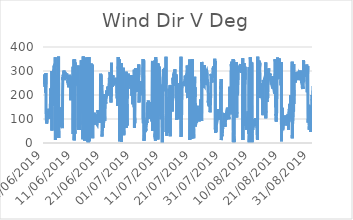
| Category | Wind Dir V |
|---|---|
| 01/06/2019 | 286 |
| 01/06/2019 | 285 |
| 01/06/2019 | 246 |
| 01/06/2019 | 266 |
| 01/06/2019 | 246 |
| 01/06/2019 | 245 |
| 01/06/2019 | 257 |
| 01/06/2019 | 244 |
| 01/06/2019 | 234 |
| 01/06/2019 | 235 |
| 01/06/2019 | 285 |
| 01/06/2019 | 281 |
| 01/06/2019 | 210 |
| 01/06/2019 | 235 |
| 01/06/2019 | 265 |
| 01/06/2019 | 292 |
| 01/06/2019 | 244 |
| 01/06/2019 | 118 |
| 01/06/2019 | 106 |
| 01/06/2019 | 94 |
| 01/06/2019 | 91 |
| 01/06/2019 | 81 |
| 01/06/2019 | 84 |
| 01/06/2019 | 78 |
| 02/06/2019 | 83 |
| 02/06/2019 | 87 |
| 02/06/2019 | 93 |
| 02/06/2019 | 100 |
| 02/06/2019 | 101 |
| 02/06/2019 | 100 |
| 02/06/2019 | 100 |
| 02/06/2019 | 101 |
| 02/06/2019 | 103 |
| 02/06/2019 | 98 |
| 02/06/2019 | 97 |
| 02/06/2019 | 105 |
| 02/06/2019 | 117 |
| 02/06/2019 | 127 |
| 02/06/2019 | 143 |
| 02/06/2019 | 138 |
| 02/06/2019 | 136 |
| 02/06/2019 | 135 |
| 02/06/2019 | 120 |
| 02/06/2019 | 112 |
| 02/06/2019 | 102 |
| 02/06/2019 | 106 |
| 02/06/2019 | 104 |
| 02/06/2019 | 102 |
| 03/06/2019 | 107 |
| 03/06/2019 | 119 |
| 03/06/2019 | 128 |
| 03/06/2019 | 156 |
| 03/06/2019 | 152 |
| 03/06/2019 | 173 |
| 03/06/2019 | 192 |
| 03/06/2019 | 183 |
| 03/06/2019 | 225 |
| 03/06/2019 | 220 |
| 03/06/2019 | 229 |
| 03/06/2019 | 233 |
| 03/06/2019 | 224 |
| 03/06/2019 | 212 |
| 03/06/2019 | 233 |
| 03/06/2019 | 238 |
| 03/06/2019 | 300 |
| 03/06/2019 | 52 |
| 03/06/2019 | 149 |
| 03/06/2019 | 182 |
| 03/06/2019 | 172 |
| 03/06/2019 | 154 |
| 03/06/2019 | 223 |
| 03/06/2019 | 190 |
| 04/06/2019 | 166 |
| 04/06/2019 | 196 |
| 04/06/2019 | 217 |
| 04/06/2019 | 243 |
| 04/06/2019 | 250 |
| 04/06/2019 | 281 |
| 04/06/2019 | 299 |
| 04/06/2019 | 312 |
| 04/06/2019 | 319 |
| 04/06/2019 | 321 |
| 04/06/2019 | 321 |
| 04/06/2019 | 317 |
| 04/06/2019 | 319 |
| 04/06/2019 | 318 |
| 04/06/2019 | 324 |
| 04/06/2019 | 326 |
| 04/06/2019 | 324 |
| 04/06/2019 | 317 |
| 04/06/2019 | 321 |
| 04/06/2019 | 331 |
| 04/06/2019 | 357 |
| 04/06/2019 | 13 |
| 04/06/2019 | 15 |
| 04/06/2019 | 36 |
| 05/06/2019 | 102 |
| 05/06/2019 | 98 |
| 05/06/2019 | 94 |
| 05/06/2019 | 90 |
| 05/06/2019 | 95 |
| 05/06/2019 | 112 |
| 05/06/2019 | 126 |
| 05/06/2019 | 159 |
| 05/06/2019 | 181 |
| 05/06/2019 | 192 |
| 05/06/2019 | 196 |
| 05/06/2019 | 209 |
| 05/06/2019 | 226 |
| 05/06/2019 | 249 |
| 05/06/2019 | 266 |
| 05/06/2019 | 282 |
| 05/06/2019 | 283 |
| 05/06/2019 | 287 |
| 05/06/2019 | 291 |
| 05/06/2019 | 298 |
| 05/06/2019 | 319 |
| 05/06/2019 | 335 |
| 05/06/2019 | 341 |
| 05/06/2019 | 360 |
| 06/06/2019 | 21 |
| 06/06/2019 | 50 |
| 06/06/2019 | 103 |
| 06/06/2019 | 95 |
| 06/06/2019 | 105 |
| 06/06/2019 | 83 |
| 06/06/2019 | 100 |
| 06/06/2019 | 120 |
| 06/06/2019 | 129 |
| 06/06/2019 | 130 |
| 06/06/2019 | 124 |
| 06/06/2019 | 142 |
| 06/06/2019 | 141 |
| 06/06/2019 | 146 |
| 06/06/2019 | 142 |
| 06/06/2019 | 135 |
| 06/06/2019 | 139 |
| 06/06/2019 | 148 |
| 06/06/2019 | 143 |
| 06/06/2019 | 131 |
| 06/06/2019 | 108 |
| 06/06/2019 | 95 |
| 06/06/2019 | 92 |
| 06/06/2019 | 92 |
| 07/06/2019 | 67 |
| 07/06/2019 | 126 |
| 07/06/2019 | 83 |
| 07/06/2019 | 77 |
| 07/06/2019 | 84 |
| 07/06/2019 | 62 |
| 07/06/2019 | 78 |
| 07/06/2019 | 107 |
| 07/06/2019 | 218 |
| 07/06/2019 | 243 |
| 07/06/2019 | 274 |
| 07/06/2019 | 262 |
| 07/06/2019 | 276 |
| 07/06/2019 | 285 |
| 07/06/2019 | 279 |
| 07/06/2019 | 281 |
| 07/06/2019 | 280 |
| 07/06/2019 | 288 |
| 07/06/2019 | 289 |
| 07/06/2019 | 302 |
| 07/06/2019 | 301 |
| 07/06/2019 | 289 |
| 07/06/2019 | 297 |
| 07/06/2019 | 283 |
| 08/06/2019 | 271 |
| 08/06/2019 | 262 |
| 08/06/2019 | 271 |
| 08/06/2019 | 295 |
| 08/06/2019 | 299 |
| 08/06/2019 | 297 |
| 08/06/2019 | 296 |
| 08/06/2019 | 297 |
| 08/06/2019 | 291 |
| 08/06/2019 | 295 |
| 08/06/2019 | 292 |
| 08/06/2019 | 283 |
| 08/06/2019 | 282 |
| 08/06/2019 | 283 |
| 08/06/2019 | 280 |
| 08/06/2019 | 284 |
| 08/06/2019 | 282 |
| 08/06/2019 | 284 |
| 08/06/2019 | 290 |
| 08/06/2019 | 279 |
| 08/06/2019 | 268 |
| 08/06/2019 | 271 |
| 08/06/2019 | 276 |
| 08/06/2019 | 275 |
| 09/06/2019 | 284 |
| 09/06/2019 | 277 |
| 09/06/2019 | 273 |
| 09/06/2019 | 271 |
| 09/06/2019 | 249 |
| 09/06/2019 | 261 |
| 09/06/2019 | 250 |
| 09/06/2019 | 243 |
| 09/06/2019 | 243 |
| 09/06/2019 | 250 |
| 09/06/2019 | 232 |
| 09/06/2019 | 237 |
| 09/06/2019 | 246 |
| 09/06/2019 | 252 |
| 09/06/2019 | 284 |
| 09/06/2019 | 282 |
| 09/06/2019 | 287 |
| 09/06/2019 | 285 |
| 09/06/2019 | 280 |
| 09/06/2019 | 271 |
| 09/06/2019 | 257 |
| 09/06/2019 | 261 |
| 09/06/2019 | 264 |
| 09/06/2019 | 265 |
| 10/06/2019 | 261 |
| 10/06/2019 | 258 |
| 10/06/2019 | 255 |
| 10/06/2019 | 247 |
| 10/06/2019 | 178 |
| 10/06/2019 | 236 |
| 10/06/2019 | 233 |
| 10/06/2019 | 180 |
| 10/06/2019 | 199 |
| 10/06/2019 | 209 |
| 10/06/2019 | 260 |
| 10/06/2019 | 247 |
| 10/06/2019 | 268 |
| 10/06/2019 | 261 |
| 10/06/2019 | 244 |
| 10/06/2019 | 256 |
| 10/06/2019 | 266 |
| 10/06/2019 | 264 |
| 10/06/2019 | 277 |
| 10/06/2019 | 238 |
| 10/06/2019 | 264 |
| 10/06/2019 | 300 |
| 10/06/2019 | 318 |
| 10/06/2019 | 38 |
| 11/06/2019 | 267 |
| 11/06/2019 | 222 |
| 11/06/2019 | 160 |
| 11/06/2019 | 301 |
| 11/06/2019 | 305 |
| 11/06/2019 | 289 |
| 11/06/2019 | 348 |
| 11/06/2019 | 11 |
| 11/06/2019 | 27 |
| 11/06/2019 | 31 |
| 11/06/2019 | 49 |
| 11/06/2019 | 348 |
| 11/06/2019 | 350 |
| 11/06/2019 | 39 |
| 11/06/2019 | 49 |
| 11/06/2019 | 335 |
| 11/06/2019 | 289 |
| 11/06/2019 | 274 |
| 11/06/2019 | 284 |
| 11/06/2019 | 288 |
| 11/06/2019 | 281 |
| 11/06/2019 | 294 |
| 11/06/2019 | 296 |
| 11/06/2019 | 278 |
| 12/06/2019 | 267 |
| 12/06/2019 | 282 |
| 12/06/2019 | 272 |
| 12/06/2019 | 257 |
| 12/06/2019 | 260 |
| 12/06/2019 | 265 |
| 12/06/2019 | 258 |
| 12/06/2019 | 258 |
| 12/06/2019 | 263 |
| 12/06/2019 | 280 |
| 12/06/2019 | 264 |
| 12/06/2019 | 243 |
| 12/06/2019 | 263 |
| 12/06/2019 | 244 |
| 12/06/2019 | 237 |
| 12/06/2019 | 243 |
| 12/06/2019 | 323 |
| 12/06/2019 | 68 |
| 12/06/2019 | 55 |
| 12/06/2019 | 66 |
| 12/06/2019 | 90 |
| 12/06/2019 | 91 |
| 12/06/2019 | 102 |
| 12/06/2019 | 103 |
| 13/06/2019 | 104 |
| 13/06/2019 | 97 |
| 13/06/2019 | 111 |
| 13/06/2019 | 54 |
| 13/06/2019 | 80 |
| 13/06/2019 | 80 |
| 13/06/2019 | 91 |
| 13/06/2019 | 77 |
| 13/06/2019 | 166 |
| 13/06/2019 | 124 |
| 13/06/2019 | 125 |
| 13/06/2019 | 142 |
| 13/06/2019 | 241 |
| 13/06/2019 | 275 |
| 13/06/2019 | 272 |
| 13/06/2019 | 288 |
| 13/06/2019 | 303 |
| 13/06/2019 | 345 |
| 13/06/2019 | 236 |
| 13/06/2019 | 253 |
| 13/06/2019 | 280 |
| 13/06/2019 | 243 |
| 13/06/2019 | 133 |
| 13/06/2019 | 127 |
| 14/06/2019 | 171 |
| 14/06/2019 | 147 |
| 14/06/2019 | 129 |
| 14/06/2019 | 199 |
| 14/06/2019 | 128 |
| 14/06/2019 | 16 |
| 14/06/2019 | 58 |
| 14/06/2019 | 80 |
| 14/06/2019 | 334 |
| 14/06/2019 | 274 |
| 14/06/2019 | 360 |
| 14/06/2019 | 151 |
| 14/06/2019 | 133 |
| 14/06/2019 | 107 |
| 14/06/2019 | 93 |
| 14/06/2019 | 106 |
| 14/06/2019 | 112 |
| 14/06/2019 | 126 |
| 14/06/2019 | 89 |
| 14/06/2019 | 9 |
| 14/06/2019 | 57 |
| 14/06/2019 | 80 |
| 14/06/2019 | 94 |
| 14/06/2019 | 34 |
| 15/06/2019 | 17 |
| 15/06/2019 | 44 |
| 15/06/2019 | 355 |
| 15/06/2019 | 312 |
| 15/06/2019 | 340 |
| 15/06/2019 | 65 |
| 15/06/2019 | 49 |
| 15/06/2019 | 295 |
| 15/06/2019 | 292 |
| 15/06/2019 | 282 |
| 15/06/2019 | 282 |
| 15/06/2019 | 297 |
| 15/06/2019 | 309 |
| 15/06/2019 | 352 |
| 15/06/2019 | 335 |
| 15/06/2019 | 337 |
| 15/06/2019 | 356 |
| 15/06/2019 | 24 |
| 15/06/2019 | 22 |
| 15/06/2019 | 26 |
| 15/06/2019 | 14 |
| 15/06/2019 | 24 |
| 15/06/2019 | 21 |
| 15/06/2019 | 6 |
| 16/06/2019 | 333 |
| 16/06/2019 | 327 |
| 16/06/2019 | 321 |
| 16/06/2019 | 0 |
| 16/06/2019 | 10 |
| 16/06/2019 | 305 |
| 16/06/2019 | 316 |
| 16/06/2019 | 330 |
| 16/06/2019 | 333 |
| 16/06/2019 | 348 |
| 16/06/2019 | 358 |
| 16/06/2019 | 12 |
| 16/06/2019 | 7 |
| 16/06/2019 | 9 |
| 16/06/2019 | 34 |
| 16/06/2019 | 22 |
| 16/06/2019 | 21 |
| 16/06/2019 | 29 |
| 16/06/2019 | 34 |
| 16/06/2019 | 48 |
| 16/06/2019 | 57 |
| 16/06/2019 | 59 |
| 16/06/2019 | 50 |
| 16/06/2019 | 45 |
| 17/06/2019 | 41 |
| 17/06/2019 | 255 |
| 17/06/2019 | 267 |
| 17/06/2019 | 319 |
| 17/06/2019 | 331 |
| 17/06/2019 | 321 |
| 17/06/2019 | 253 |
| 17/06/2019 | 246 |
| 17/06/2019 | 254 |
| 17/06/2019 | 277 |
| 17/06/2019 | 305 |
| 17/06/2019 | 296 |
| 17/06/2019 | 256 |
| 17/06/2019 | 326 |
| 17/06/2019 | 59 |
| 17/06/2019 | 20 |
| 17/06/2019 | 75 |
| 17/06/2019 | 92 |
| 17/06/2019 | 75 |
| 17/06/2019 | 78 |
| 17/06/2019 | 85 |
| 17/06/2019 | 94 |
| 17/06/2019 | 100 |
| 17/06/2019 | 114 |
| 18/06/2019 | 113 |
| 18/06/2019 | 81 |
| 18/06/2019 | 76 |
| 18/06/2019 | 126 |
| 18/06/2019 | 95 |
| 18/06/2019 | 78 |
| 18/06/2019 | 90 |
| 18/06/2019 | 117 |
| 18/06/2019 | 93 |
| 18/06/2019 | 113 |
| 18/06/2019 | 92 |
| 18/06/2019 | 95 |
| 18/06/2019 | 111 |
| 18/06/2019 | 107 |
| 18/06/2019 | 104 |
| 18/06/2019 | 111 |
| 18/06/2019 | 119 |
| 18/06/2019 | 116 |
| 18/06/2019 | 111 |
| 18/06/2019 | 116 |
| 18/06/2019 | 88 |
| 18/06/2019 | 83 |
| 18/06/2019 | 84 |
| 18/06/2019 | 87 |
| 19/06/2019 | 85 |
| 19/06/2019 | 80 |
| 19/06/2019 | 82 |
| 19/06/2019 | 81 |
| 19/06/2019 | 77 |
| 19/06/2019 | 83 |
| 19/06/2019 | 88 |
| 19/06/2019 | 103 |
| 19/06/2019 | 126 |
| 19/06/2019 | 137 |
| 19/06/2019 | 137 |
| 19/06/2019 | 133 |
| 19/06/2019 | 127 |
| 19/06/2019 | 128 |
| 19/06/2019 | 129 |
| 19/06/2019 | 127 |
| 19/06/2019 | 126 |
| 19/06/2019 | 127 |
| 19/06/2019 | 130 |
| 19/06/2019 | 120 |
| 19/06/2019 | 113 |
| 19/06/2019 | 117 |
| 19/06/2019 | 104 |
| 19/06/2019 | 104 |
| 20/06/2019 | 94 |
| 20/06/2019 | 86 |
| 20/06/2019 | 87 |
| 20/06/2019 | 91 |
| 20/06/2019 | 84 |
| 20/06/2019 | 88 |
| 20/06/2019 | 109 |
| 20/06/2019 | 222 |
| 20/06/2019 | 289 |
| 20/06/2019 | 258 |
| 20/06/2019 | 287 |
| 20/06/2019 | 285 |
| 20/06/2019 | 286 |
| 20/06/2019 | 287 |
| 20/06/2019 | 244 |
| 20/06/2019 | 246 |
| 20/06/2019 | 240 |
| 20/06/2019 | 237 |
| 20/06/2019 | 242 |
| 20/06/2019 | 200 |
| 20/06/2019 | 27 |
| 20/06/2019 | 38 |
| 20/06/2019 | 42 |
| 20/06/2019 | 52 |
| 21/06/2019 | 64 |
| 21/06/2019 | 65 |
| 21/06/2019 | 71 |
| 21/06/2019 | 63 |
| 21/06/2019 | 68 |
| 21/06/2019 | 74 |
| 21/06/2019 | 65 |
| 21/06/2019 | 74 |
| 21/06/2019 | 82 |
| 21/06/2019 | 85 |
| 21/06/2019 | 87 |
| 21/06/2019 | 88 |
| 21/06/2019 | 90 |
| 21/06/2019 | 95 |
| 21/06/2019 | 95 |
| 21/06/2019 | 99 |
| 21/06/2019 | 204 |
| 21/06/2019 | 113 |
| 21/06/2019 | 92 |
| 21/06/2019 | 98 |
| 21/06/2019 | 105 |
| 21/06/2019 | 137 |
| 21/06/2019 | 157 |
| 21/06/2019 | 170 |
| 22/06/2019 | 173 |
| 22/06/2019 | 177 |
| 22/06/2019 | 164 |
| 22/06/2019 | 170 |
| 22/06/2019 | 180 |
| 22/06/2019 | 181 |
| 22/06/2019 | 186 |
| 22/06/2019 | 197 |
| 22/06/2019 | 196 |
| 22/06/2019 | 191 |
| 22/06/2019 | 219 |
| 22/06/2019 | 197 |
| 22/06/2019 | 197 |
| 22/06/2019 | 195 |
| 22/06/2019 | 207 |
| 22/06/2019 | 199 |
| 22/06/2019 | 198 |
| 22/06/2019 | 198 |
| 22/06/2019 | 210 |
| 22/06/2019 | 215 |
| 22/06/2019 | 235 |
| 22/06/2019 | 223 |
| 22/06/2019 | 235 |
| 22/06/2019 | 234 |
| 23/06/2019 | 239 |
| 23/06/2019 | 234 |
| 23/06/2019 | 238 |
| 23/06/2019 | 223 |
| 23/06/2019 | 229 |
| 23/06/2019 | 237 |
| 23/06/2019 | 247 |
| 23/06/2019 | 260 |
| 23/06/2019 | 271 |
| 23/06/2019 | 260 |
| 23/06/2019 | 259 |
| 23/06/2019 | 261 |
| 23/06/2019 | 271 |
| 23/06/2019 | 289 |
| 23/06/2019 | 296 |
| 23/06/2019 | 261 |
| 23/06/2019 | 245 |
| 23/06/2019 | 238 |
| 23/06/2019 | 228 |
| 23/06/2019 | 218 |
| 23/06/2019 | 198 |
| 23/06/2019 | 169 |
| 23/06/2019 | 246 |
| 23/06/2019 | 195 |
| 24/06/2019 | 257 |
| 24/06/2019 | 304 |
| 24/06/2019 | 334 |
| 24/06/2019 | 245 |
| 24/06/2019 | 262 |
| 24/06/2019 | 248 |
| 24/06/2019 | 250 |
| 24/06/2019 | 233 |
| 24/06/2019 | 266 |
| 24/06/2019 | 244 |
| 24/06/2019 | 249 |
| 24/06/2019 | 255 |
| 24/06/2019 | 260 |
| 24/06/2019 | 273 |
| 24/06/2019 | 282 |
| 24/06/2019 | 275 |
| 24/06/2019 | 274 |
| 24/06/2019 | 271 |
| 24/06/2019 | 240 |
| 24/06/2019 | 253 |
| 24/06/2019 | 269 |
| 24/06/2019 | 256 |
| 24/06/2019 | 264 |
| 24/06/2019 | 254 |
| 25/06/2019 | 256 |
| 25/06/2019 | 264 |
| 25/06/2019 | 257 |
| 25/06/2019 | 258 |
| 25/06/2019 | 258 |
| 25/06/2019 | 254 |
| 25/06/2019 | 247 |
| 25/06/2019 | 269 |
| 25/06/2019 | 261 |
| 25/06/2019 | 250 |
| 25/06/2019 | 246 |
| 25/06/2019 | 247 |
| 25/06/2019 | 264 |
| 25/06/2019 | 261 |
| 25/06/2019 | 259 |
| 25/06/2019 | 258 |
| 25/06/2019 | 258 |
| 25/06/2019 | 254 |
| 25/06/2019 | 259 |
| 25/06/2019 | 272 |
| 25/06/2019 | 244 |
| 25/06/2019 | 216 |
| 25/06/2019 | 219 |
| 25/06/2019 | 214 |
| 26/06/2019 | 185 |
| 26/06/2019 | 267 |
| 26/06/2019 | 225 |
| 26/06/2019 | 154 |
| 26/06/2019 | 225 |
| 26/06/2019 | 255 |
| 26/06/2019 | 243 |
| 26/06/2019 | 245 |
| 26/06/2019 | 241 |
| 26/06/2019 | 358 |
| 26/06/2019 | 309 |
| 26/06/2019 | 280 |
| 26/06/2019 | 260 |
| 26/06/2019 | 282 |
| 26/06/2019 | 258 |
| 26/06/2019 | 278 |
| 26/06/2019 | 264 |
| 26/06/2019 | 316 |
| 26/06/2019 | 277 |
| 26/06/2019 | 348 |
| 26/06/2019 | 7 |
| 26/06/2019 | 32 |
| 26/06/2019 | 57 |
| 26/06/2019 | 42 |
| 27/06/2019 | 54 |
| 27/06/2019 | 59 |
| 27/06/2019 | 60 |
| 27/06/2019 | 72 |
| 27/06/2019 | 58 |
| 27/06/2019 | 47 |
| 27/06/2019 | 47 |
| 27/06/2019 | 61 |
| 27/06/2019 | 55 |
| 27/06/2019 | 16 |
| 27/06/2019 | 333 |
| 27/06/2019 | 5 |
| 27/06/2019 | 67 |
| 27/06/2019 | 69 |
| 27/06/2019 | 81 |
| 27/06/2019 | 88 |
| 27/06/2019 | 90 |
| 27/06/2019 | 84 |
| 27/06/2019 | 81 |
| 27/06/2019 | 78 |
| 27/06/2019 | 74 |
| 27/06/2019 | 74 |
| 27/06/2019 | 78 |
| 27/06/2019 | 83 |
| 28/06/2019 | 89 |
| 28/06/2019 | 91 |
| 28/06/2019 | 265 |
| 28/06/2019 | 314 |
| 28/06/2019 | 69 |
| 28/06/2019 | 74 |
| 28/06/2019 | 59 |
| 28/06/2019 | 32 |
| 28/06/2019 | 52 |
| 28/06/2019 | 89 |
| 28/06/2019 | 118 |
| 28/06/2019 | 147 |
| 28/06/2019 | 118 |
| 28/06/2019 | 125 |
| 28/06/2019 | 104 |
| 28/06/2019 | 92 |
| 28/06/2019 | 86 |
| 28/06/2019 | 94 |
| 28/06/2019 | 100 |
| 28/06/2019 | 101 |
| 28/06/2019 | 92 |
| 28/06/2019 | 85 |
| 28/06/2019 | 82 |
| 28/06/2019 | 84 |
| 29/06/2019 | 98 |
| 29/06/2019 | 92 |
| 29/06/2019 | 297 |
| 29/06/2019 | 79 |
| 29/06/2019 | 78 |
| 29/06/2019 | 63 |
| 29/06/2019 | 81 |
| 29/06/2019 | 97 |
| 29/06/2019 | 88 |
| 29/06/2019 | 82 |
| 29/06/2019 | 73 |
| 29/06/2019 | 163 |
| 29/06/2019 | 187 |
| 29/06/2019 | 227 |
| 29/06/2019 | 234 |
| 29/06/2019 | 228 |
| 29/06/2019 | 234 |
| 29/06/2019 | 226 |
| 29/06/2019 | 251 |
| 29/06/2019 | 289 |
| 29/06/2019 | 291 |
| 29/06/2019 | 287 |
| 29/06/2019 | 260 |
| 29/06/2019 | 251 |
| 30/06/2019 | 240 |
| 30/06/2019 | 257 |
| 30/06/2019 | 248 |
| 30/06/2019 | 240 |
| 30/06/2019 | 251 |
| 30/06/2019 | 245 |
| 30/06/2019 | 239 |
| 30/06/2019 | 244 |
| 30/06/2019 | 257 |
| 30/06/2019 | 263 |
| 30/06/2019 | 268 |
| 30/06/2019 | 261 |
| 30/06/2019 | 282 |
| 30/06/2019 | 265 |
| 30/06/2019 | 260 |
| 30/06/2019 | 262 |
| 30/06/2019 | 234 |
| 30/06/2019 | 236 |
| 30/06/2019 | 237 |
| 30/06/2019 | 229 |
| 30/06/2019 | 241 |
| 30/06/2019 | 254 |
| 30/06/2019 | 270 |
| 30/06/2019 | 250 |
| 01/07/2019 | 246 |
| 01/07/2019 | 283 |
| 01/07/2019 | 197 |
| 01/07/2019 | 254 |
| 01/07/2019 | 222 |
| 01/07/2019 | 266 |
| 01/07/2019 | 202 |
| 01/07/2019 | 161 |
| 01/07/2019 | 173 |
| 01/07/2019 | 182 |
| 01/07/2019 | 201 |
| 01/07/2019 | 193 |
| 01/07/2019 | 182 |
| 01/07/2019 | 190 |
| 01/07/2019 | 198 |
| 01/07/2019 | 191 |
| 01/07/2019 | 196 |
| 01/07/2019 | 183 |
| 01/07/2019 | 176 |
| 01/07/2019 | 154 |
| 01/07/2019 | 149 |
| 01/07/2019 | 305 |
| 01/07/2019 | 64 |
| 01/07/2019 | 114 |
| 02/07/2019 | 82 |
| 02/07/2019 | 107 |
| 02/07/2019 | 143 |
| 02/07/2019 | 246 |
| 02/07/2019 | 266 |
| 02/07/2019 | 305 |
| 02/07/2019 | 305 |
| 02/07/2019 | 311 |
| 02/07/2019 | 298 |
| 02/07/2019 | 305 |
| 02/07/2019 | 307 |
| 02/07/2019 | 310 |
| 02/07/2019 | 305 |
| 02/07/2019 | 279 |
| 02/07/2019 | 265 |
| 02/07/2019 | 296 |
| 02/07/2019 | 309 |
| 02/07/2019 | 288 |
| 02/07/2019 | 295 |
| 02/07/2019 | 309 |
| 02/07/2019 | 306 |
| 02/07/2019 | 212 |
| 02/07/2019 | 268 |
| 02/07/2019 | 264 |
| 03/07/2019 | 247 |
| 03/07/2019 | 236 |
| 03/07/2019 | 262 |
| 03/07/2019 | 275 |
| 03/07/2019 | 250 |
| 03/07/2019 | 262 |
| 03/07/2019 | 279 |
| 03/07/2019 | 290 |
| 03/07/2019 | 269 |
| 03/07/2019 | 327 |
| 03/07/2019 | 274 |
| 03/07/2019 | 204 |
| 03/07/2019 | 169 |
| 03/07/2019 | 172 |
| 03/07/2019 | 195 |
| 03/07/2019 | 224 |
| 03/07/2019 | 223 |
| 03/07/2019 | 197 |
| 03/07/2019 | 222 |
| 03/07/2019 | 225 |
| 03/07/2019 | 229 |
| 03/07/2019 | 239 |
| 03/07/2019 | 230 |
| 03/07/2019 | 258 |
| 04/07/2019 | 242 |
| 04/07/2019 | 252 |
| 04/07/2019 | 248 |
| 04/07/2019 | 228 |
| 04/07/2019 | 234 |
| 04/07/2019 | 216 |
| 04/07/2019 | 200 |
| 04/07/2019 | 237 |
| 04/07/2019 | 237 |
| 04/07/2019 | 229 |
| 04/07/2019 | 223 |
| 04/07/2019 | 257 |
| 04/07/2019 | 247 |
| 04/07/2019 | 246 |
| 04/07/2019 | 253 |
| 04/07/2019 | 239 |
| 04/07/2019 | 236 |
| 04/07/2019 | 246 |
| 04/07/2019 | 261 |
| 04/07/2019 | 314 |
| 04/07/2019 | 324 |
| 04/07/2019 | 350 |
| 04/07/2019 | 101 |
| 04/07/2019 | 82 |
| 05/07/2019 | 251 |
| 05/07/2019 | 337 |
| 05/07/2019 | 345 |
| 05/07/2019 | 348 |
| 05/07/2019 | 342 |
| 05/07/2019 | 9 |
| 05/07/2019 | 34 |
| 05/07/2019 | 74 |
| 05/07/2019 | 81 |
| 05/07/2019 | 66 |
| 05/07/2019 | 58 |
| 05/07/2019 | 45 |
| 05/07/2019 | 47 |
| 05/07/2019 | 52 |
| 05/07/2019 | 46 |
| 05/07/2019 | 46 |
| 05/07/2019 | 56 |
| 05/07/2019 | 63 |
| 05/07/2019 | 64 |
| 05/07/2019 | 65 |
| 05/07/2019 | 51 |
| 05/07/2019 | 58 |
| 05/07/2019 | 68 |
| 05/07/2019 | 69 |
| 06/07/2019 | 76 |
| 06/07/2019 | 95 |
| 06/07/2019 | 84 |
| 06/07/2019 | 89 |
| 06/07/2019 | 86 |
| 06/07/2019 | 84 |
| 06/07/2019 | 106 |
| 06/07/2019 | 113 |
| 06/07/2019 | 126 |
| 06/07/2019 | 146 |
| 06/07/2019 | 145 |
| 06/07/2019 | 162 |
| 06/07/2019 | 169 |
| 06/07/2019 | 131 |
| 06/07/2019 | 146 |
| 06/07/2019 | 155 |
| 06/07/2019 | 177 |
| 06/07/2019 | 168 |
| 06/07/2019 | 174 |
| 06/07/2019 | 173 |
| 06/07/2019 | 128 |
| 06/07/2019 | 111 |
| 06/07/2019 | 100 |
| 06/07/2019 | 105 |
| 07/07/2019 | 107 |
| 07/07/2019 | 100 |
| 07/07/2019 | 102 |
| 07/07/2019 | 104 |
| 07/07/2019 | 107 |
| 07/07/2019 | 103 |
| 07/07/2019 | 118 |
| 07/07/2019 | 129 |
| 07/07/2019 | 140 |
| 07/07/2019 | 140 |
| 07/07/2019 | 140 |
| 07/07/2019 | 142 |
| 07/07/2019 | 144 |
| 07/07/2019 | 148 |
| 07/07/2019 | 159 |
| 07/07/2019 | 162 |
| 07/07/2019 | 171 |
| 07/07/2019 | 162 |
| 07/07/2019 | 160 |
| 07/07/2019 | 148 |
| 07/07/2019 | 112 |
| 07/07/2019 | 90 |
| 07/07/2019 | 124 |
| 07/07/2019 | 120 |
| 08/07/2019 | 298 |
| 08/07/2019 | 335 |
| 08/07/2019 | 342 |
| 08/07/2019 | 50 |
| 08/07/2019 | 116 |
| 08/07/2019 | 150 |
| 08/07/2019 | 139 |
| 08/07/2019 | 272 |
| 08/07/2019 | 341 |
| 08/07/2019 | 343 |
| 08/07/2019 | 268 |
| 08/07/2019 | 233 |
| 08/07/2019 | 257 |
| 08/07/2019 | 250 |
| 08/07/2019 | 325 |
| 08/07/2019 | 341 |
| 08/07/2019 | 321 |
| 08/07/2019 | 324 |
| 08/07/2019 | 328 |
| 08/07/2019 | 311 |
| 08/07/2019 | 303 |
| 08/07/2019 | 315 |
| 08/07/2019 | 325 |
| 08/07/2019 | 345 |
| 09/07/2019 | 24 |
| 09/07/2019 | 39 |
| 09/07/2019 | 8 |
| 09/07/2019 | 9 |
| 09/07/2019 | 352 |
| 09/07/2019 | 358 |
| 09/07/2019 | 355 |
| 09/07/2019 | 334 |
| 09/07/2019 | 245 |
| 09/07/2019 | 239 |
| 09/07/2019 | 287 |
| 09/07/2019 | 302 |
| 09/07/2019 | 315 |
| 09/07/2019 | 319 |
| 09/07/2019 | 324 |
| 09/07/2019 | 326 |
| 09/07/2019 | 333 |
| 09/07/2019 | 316 |
| 09/07/2019 | 298 |
| 09/07/2019 | 304 |
| 09/07/2019 | 316 |
| 09/07/2019 | 321 |
| 09/07/2019 | 315 |
| 09/07/2019 | 15 |
| 10/07/2019 | 331 |
| 10/07/2019 | 298 |
| 10/07/2019 | 308 |
| 10/07/2019 | 302 |
| 10/07/2019 | 311 |
| 10/07/2019 | 297 |
| 10/07/2019 | 301 |
| 10/07/2019 | 310 |
| 10/07/2019 | 310 |
| 10/07/2019 | 318 |
| 10/07/2019 | 319 |
| 10/07/2019 | 317 |
| 10/07/2019 | 296 |
| 10/07/2019 | 264 |
| 10/07/2019 | 228 |
| 10/07/2019 | 223 |
| 10/07/2019 | 224 |
| 10/07/2019 | 169 |
| 10/07/2019 | 181 |
| 10/07/2019 | 188 |
| 10/07/2019 | 138 |
| 10/07/2019 | 106 |
| 10/07/2019 | 99 |
| 10/07/2019 | 98 |
| 11/07/2019 | 103 |
| 11/07/2019 | 105 |
| 11/07/2019 | 107 |
| 11/07/2019 | 121 |
| 11/07/2019 | 156 |
| 11/07/2019 | 165 |
| 11/07/2019 | 182 |
| 11/07/2019 | 191 |
| 11/07/2019 | 198 |
| 11/07/2019 | 227 |
| 11/07/2019 | 229 |
| 11/07/2019 | 0 |
| 11/07/2019 | 241 |
| 11/07/2019 | 245 |
| 11/07/2019 | 244 |
| 11/07/2019 | 247 |
| 11/07/2019 | 264 |
| 11/07/2019 | 274 |
| 11/07/2019 | 277 |
| 11/07/2019 | 297 |
| 11/07/2019 | 308 |
| 11/07/2019 | 284 |
| 11/07/2019 | 270 |
| 11/07/2019 | 275 |
| 12/07/2019 | 265 |
| 12/07/2019 | 264 |
| 12/07/2019 | 280 |
| 12/07/2019 | 294 |
| 12/07/2019 | 313 |
| 12/07/2019 | 256 |
| 12/07/2019 | 242 |
| 12/07/2019 | 245 |
| 12/07/2019 | 216 |
| 12/07/2019 | 269 |
| 12/07/2019 | 251 |
| 12/07/2019 | 241 |
| 12/07/2019 | 250 |
| 12/07/2019 | 285 |
| 12/07/2019 | 262 |
| 12/07/2019 | 246 |
| 12/07/2019 | 307 |
| 12/07/2019 | 359 |
| 12/07/2019 | 46 |
| 12/07/2019 | 112 |
| 12/07/2019 | 121 |
| 12/07/2019 | 95 |
| 12/07/2019 | 59 |
| 12/07/2019 | 30 |
| 13/07/2019 | 43 |
| 13/07/2019 | 55 |
| 13/07/2019 | 137 |
| 13/07/2019 | 59 |
| 13/07/2019 | 42 |
| 13/07/2019 | 38 |
| 13/07/2019 | 90 |
| 13/07/2019 | 90 |
| 13/07/2019 | 90 |
| 13/07/2019 | 97 |
| 13/07/2019 | 111 |
| 13/07/2019 | 125 |
| 13/07/2019 | 132 |
| 13/07/2019 | 141 |
| 13/07/2019 | 174 |
| 13/07/2019 | 211 |
| 13/07/2019 | 217 |
| 13/07/2019 | 218 |
| 13/07/2019 | 226 |
| 13/07/2019 | 210 |
| 13/07/2019 | 103 |
| 13/07/2019 | 117 |
| 13/07/2019 | 127 |
| 13/07/2019 | 157 |
| 14/07/2019 | 210 |
| 14/07/2019 | 241 |
| 14/07/2019 | 232 |
| 14/07/2019 | 235 |
| 14/07/2019 | 28 |
| 14/07/2019 | 92 |
| 14/07/2019 | 130 |
| 14/07/2019 | 164 |
| 14/07/2019 | 231 |
| 14/07/2019 | 242 |
| 14/07/2019 | 233 |
| 14/07/2019 | 179 |
| 14/07/2019 | 196 |
| 14/07/2019 | 217 |
| 14/07/2019 | 211 |
| 14/07/2019 | 219 |
| 14/07/2019 | 216 |
| 14/07/2019 | 233 |
| 14/07/2019 | 221 |
| 14/07/2019 | 205 |
| 14/07/2019 | 192 |
| 14/07/2019 | 131 |
| 14/07/2019 | 142 |
| 14/07/2019 | 175 |
| 15/07/2019 | 182 |
| 15/07/2019 | 230 |
| 15/07/2019 | 251 |
| 15/07/2019 | 272 |
| 15/07/2019 | 247 |
| 15/07/2019 | 264 |
| 15/07/2019 | 275 |
| 15/07/2019 | 271 |
| 15/07/2019 | 267 |
| 15/07/2019 | 287 |
| 15/07/2019 | 282 |
| 15/07/2019 | 289 |
| 15/07/2019 | 289 |
| 15/07/2019 | 295 |
| 15/07/2019 | 286 |
| 15/07/2019 | 301 |
| 15/07/2019 | 305 |
| 15/07/2019 | 304 |
| 15/07/2019 | 307 |
| 15/07/2019 | 303 |
| 15/07/2019 | 295 |
| 15/07/2019 | 287 |
| 15/07/2019 | 238 |
| 15/07/2019 | 247 |
| 16/07/2019 | 252 |
| 16/07/2019 | 262 |
| 16/07/2019 | 246 |
| 16/07/2019 | 252 |
| 16/07/2019 | 286 |
| 16/07/2019 | 186 |
| 16/07/2019 | 248 |
| 16/07/2019 | 207 |
| 16/07/2019 | 97 |
| 16/07/2019 | 118 |
| 16/07/2019 | 118 |
| 16/07/2019 | 134 |
| 16/07/2019 | 138 |
| 16/07/2019 | 171 |
| 16/07/2019 | 185 |
| 16/07/2019 | 179 |
| 16/07/2019 | 148 |
| 16/07/2019 | 151 |
| 16/07/2019 | 125 |
| 16/07/2019 | 102 |
| 16/07/2019 | 107 |
| 16/07/2019 | 113 |
| 16/07/2019 | 105 |
| 16/07/2019 | 99 |
| 17/07/2019 | 96 |
| 17/07/2019 | 109 |
| 17/07/2019 | 108 |
| 17/07/2019 | 104 |
| 17/07/2019 | 116 |
| 17/07/2019 | 135 |
| 17/07/2019 | 186 |
| 17/07/2019 | 237 |
| 17/07/2019 | 242 |
| 17/07/2019 | 250 |
| 17/07/2019 | 250 |
| 17/07/2019 | 246 |
| 17/07/2019 | 251 |
| 17/07/2019 | 241 |
| 17/07/2019 | 243 |
| 17/07/2019 | 250 |
| 17/07/2019 | 252 |
| 17/07/2019 | 259 |
| 17/07/2019 | 279 |
| 17/07/2019 | 318 |
| 17/07/2019 | 359 |
| 17/07/2019 | 26 |
| 17/07/2019 | 92 |
| 17/07/2019 | 107 |
| 18/07/2019 | 98 |
| 18/07/2019 | 107 |
| 18/07/2019 | 165 |
| 18/07/2019 | 171 |
| 18/07/2019 | 211 |
| 18/07/2019 | 222 |
| 18/07/2019 | 242 |
| 18/07/2019 | 255 |
| 18/07/2019 | 251 |
| 18/07/2019 | 248 |
| 18/07/2019 | 247 |
| 18/07/2019 | 246 |
| 18/07/2019 | 248 |
| 18/07/2019 | 248 |
| 18/07/2019 | 245 |
| 18/07/2019 | 245 |
| 18/07/2019 | 245 |
| 18/07/2019 | 243 |
| 18/07/2019 | 245 |
| 18/07/2019 | 240 |
| 18/07/2019 | 237 |
| 18/07/2019 | 241 |
| 18/07/2019 | 237 |
| 18/07/2019 | 248 |
| 19/07/2019 | 251 |
| 19/07/2019 | 256 |
| 19/07/2019 | 257 |
| 19/07/2019 | 260 |
| 19/07/2019 | 256 |
| 19/07/2019 | 272 |
| 19/07/2019 | 270 |
| 19/07/2019 | 281 |
| 19/07/2019 | 273 |
| 19/07/2019 | 256 |
| 19/07/2019 | 253 |
| 19/07/2019 | 250 |
| 19/07/2019 | 247 |
| 19/07/2019 | 246 |
| 19/07/2019 | 248 |
| 19/07/2019 | 246 |
| 19/07/2019 | 246 |
| 19/07/2019 | 249 |
| 19/07/2019 | 271 |
| 19/07/2019 | 287 |
| 19/07/2019 | 289 |
| 19/07/2019 | 210 |
| 19/07/2019 | 292 |
| 19/07/2019 | 323 |
| 20/07/2019 | 313 |
| 20/07/2019 | 216 |
| 20/07/2019 | 240 |
| 20/07/2019 | 267 |
| 20/07/2019 | 187 |
| 20/07/2019 | 226 |
| 20/07/2019 | 248 |
| 20/07/2019 | 250 |
| 20/07/2019 | 270 |
| 20/07/2019 | 268 |
| 20/07/2019 | 264 |
| 20/07/2019 | 265 |
| 20/07/2019 | 260 |
| 20/07/2019 | 264 |
| 20/07/2019 | 251 |
| 20/07/2019 | 270 |
| 20/07/2019 | 319 |
| 20/07/2019 | 321 |
| 20/07/2019 | 321 |
| 20/07/2019 | 348 |
| 20/07/2019 | 13 |
| 20/07/2019 | 25 |
| 20/07/2019 | 34 |
| 20/07/2019 | 57 |
| 21/07/2019 | 65 |
| 21/07/2019 | 70 |
| 21/07/2019 | 49 |
| 21/07/2019 | 64 |
| 21/07/2019 | 60 |
| 21/07/2019 | 97 |
| 21/07/2019 | 171 |
| 21/07/2019 | 329 |
| 21/07/2019 | 32 |
| 21/07/2019 | 40 |
| 21/07/2019 | 82 |
| 21/07/2019 | 79 |
| 21/07/2019 | 31 |
| 21/07/2019 | 17 |
| 21/07/2019 | 20 |
| 21/07/2019 | 334 |
| 21/07/2019 | 324 |
| 21/07/2019 | 349 |
| 21/07/2019 | 34 |
| 21/07/2019 | 29 |
| 21/07/2019 | 40 |
| 21/07/2019 | 41 |
| 21/07/2019 | 64 |
| 21/07/2019 | 85 |
| 22/07/2019 | 106 |
| 22/07/2019 | 85 |
| 22/07/2019 | 158 |
| 22/07/2019 | 72 |
| 22/07/2019 | 20 |
| 22/07/2019 | 59 |
| 22/07/2019 | 240 |
| 22/07/2019 | 236 |
| 22/07/2019 | 230 |
| 22/07/2019 | 208 |
| 22/07/2019 | 231 |
| 22/07/2019 | 230 |
| 22/07/2019 | 276 |
| 22/07/2019 | 249 |
| 22/07/2019 | 192 |
| 22/07/2019 | 232 |
| 22/07/2019 | 115 |
| 22/07/2019 | 165 |
| 22/07/2019 | 101 |
| 22/07/2019 | 69 |
| 22/07/2019 | 72 |
| 22/07/2019 | 84 |
| 22/07/2019 | 89 |
| 22/07/2019 | 92 |
| 23/07/2019 | 96 |
| 23/07/2019 | 97 |
| 23/07/2019 | 94 |
| 23/07/2019 | 92 |
| 23/07/2019 | 84 |
| 23/07/2019 | 84 |
| 23/07/2019 | 103 |
| 23/07/2019 | 105 |
| 23/07/2019 | 133 |
| 23/07/2019 | 155 |
| 23/07/2019 | 150 |
| 23/07/2019 | 133 |
| 23/07/2019 | 143 |
| 23/07/2019 | 132 |
| 23/07/2019 | 121 |
| 23/07/2019 | 115 |
| 23/07/2019 | 123 |
| 23/07/2019 | 129 |
| 23/07/2019 | 125 |
| 23/07/2019 | 111 |
| 23/07/2019 | 100 |
| 23/07/2019 | 101 |
| 23/07/2019 | 101 |
| 23/07/2019 | 98 |
| 24/07/2019 | 90 |
| 24/07/2019 | 89 |
| 24/07/2019 | 89 |
| 24/07/2019 | 93 |
| 24/07/2019 | 98 |
| 24/07/2019 | 103 |
| 24/07/2019 | 120 |
| 24/07/2019 | 133 |
| 24/07/2019 | 129 |
| 24/07/2019 | 129 |
| 24/07/2019 | 138 |
| 24/07/2019 | 152 |
| 24/07/2019 | 173 |
| 24/07/2019 | 181 |
| 24/07/2019 | 124 |
| 24/07/2019 | 127 |
| 24/07/2019 | 128 |
| 24/07/2019 | 118 |
| 24/07/2019 | 143 |
| 24/07/2019 | 144 |
| 24/07/2019 | 123 |
| 24/07/2019 | 97 |
| 24/07/2019 | 92 |
| 24/07/2019 | 338 |
| 25/07/2019 | 259 |
| 25/07/2019 | 266 |
| 25/07/2019 | 261 |
| 25/07/2019 | 249 |
| 25/07/2019 | 267 |
| 25/07/2019 | 261 |
| 25/07/2019 | 275 |
| 25/07/2019 | 281 |
| 25/07/2019 | 285 |
| 25/07/2019 | 263 |
| 25/07/2019 | 229 |
| 25/07/2019 | 227 |
| 25/07/2019 | 236 |
| 25/07/2019 | 245 |
| 25/07/2019 | 244 |
| 25/07/2019 | 242 |
| 25/07/2019 | 245 |
| 25/07/2019 | 242 |
| 25/07/2019 | 244 |
| 25/07/2019 | 240 |
| 25/07/2019 | 273 |
| 25/07/2019 | 324 |
| 25/07/2019 | 251 |
| 25/07/2019 | 242 |
| 26/07/2019 | 243 |
| 26/07/2019 | 246 |
| 26/07/2019 | 258 |
| 26/07/2019 | 257 |
| 26/07/2019 | 256 |
| 26/07/2019 | 261 |
| 26/07/2019 | 272 |
| 26/07/2019 | 271 |
| 26/07/2019 | 278 |
| 26/07/2019 | 285 |
| 26/07/2019 | 277 |
| 26/07/2019 | 289 |
| 26/07/2019 | 294 |
| 26/07/2019 | 297 |
| 26/07/2019 | 298 |
| 26/07/2019 | 293 |
| 26/07/2019 | 299 |
| 26/07/2019 | 300 |
| 26/07/2019 | 302 |
| 26/07/2019 | 302 |
| 26/07/2019 | 288 |
| 26/07/2019 | 247 |
| 26/07/2019 | 244 |
| 26/07/2019 | 247 |
| 27/07/2019 | 249 |
| 27/07/2019 | 236 |
| 27/07/2019 | 214 |
| 27/07/2019 | 209 |
| 27/07/2019 | 168 |
| 27/07/2019 | 179 |
| 27/07/2019 | 208 |
| 27/07/2019 | 157 |
| 27/07/2019 | 155 |
| 27/07/2019 | 181 |
| 27/07/2019 | 175 |
| 27/07/2019 | 152 |
| 27/07/2019 | 160 |
| 27/07/2019 | 168 |
| 27/07/2019 | 172 |
| 27/07/2019 | 167 |
| 27/07/2019 | 176 |
| 27/07/2019 | 154 |
| 27/07/2019 | 128 |
| 27/07/2019 | 124 |
| 27/07/2019 | 135 |
| 27/07/2019 | 156 |
| 27/07/2019 | 166 |
| 27/07/2019 | 184 |
| 28/07/2019 | 201 |
| 28/07/2019 | 241 |
| 28/07/2019 | 287 |
| 28/07/2019 | 281 |
| 28/07/2019 | 285 |
| 28/07/2019 | 277 |
| 28/07/2019 | 284 |
| 28/07/2019 | 282 |
| 28/07/2019 | 287 |
| 28/07/2019 | 269 |
| 28/07/2019 | 268 |
| 28/07/2019 | 252 |
| 28/07/2019 | 252 |
| 28/07/2019 | 262 |
| 28/07/2019 | 277 |
| 28/07/2019 | 279 |
| 28/07/2019 | 287 |
| 28/07/2019 | 289 |
| 28/07/2019 | 299 |
| 28/07/2019 | 303 |
| 28/07/2019 | 314 |
| 28/07/2019 | 314 |
| 28/07/2019 | 304 |
| 28/07/2019 | 312 |
| 29/07/2019 | 320 |
| 29/07/2019 | 319 |
| 29/07/2019 | 315 |
| 29/07/2019 | 275 |
| 29/07/2019 | 277 |
| 29/07/2019 | 307 |
| 29/07/2019 | 319 |
| 29/07/2019 | 322 |
| 29/07/2019 | 335 |
| 29/07/2019 | 351 |
| 29/07/2019 | 353 |
| 29/07/2019 | 351 |
| 29/07/2019 | 327 |
| 29/07/2019 | 342 |
| 29/07/2019 | 57 |
| 29/07/2019 | 66 |
| 29/07/2019 | 43 |
| 29/07/2019 | 75 |
| 29/07/2019 | 56 |
| 29/07/2019 | 45 |
| 29/07/2019 | 68 |
| 29/07/2019 | 88 |
| 29/07/2019 | 90 |
| 29/07/2019 | 96 |
| 30/07/2019 | 97 |
| 30/07/2019 | 92 |
| 30/07/2019 | 100 |
| 30/07/2019 | 97 |
| 30/07/2019 | 90 |
| 30/07/2019 | 92 |
| 30/07/2019 | 87 |
| 30/07/2019 | 98 |
| 30/07/2019 | 118 |
| 30/07/2019 | 135 |
| 30/07/2019 | 135 |
| 30/07/2019 | 133 |
| 30/07/2019 | 127 |
| 30/07/2019 | 141 |
| 30/07/2019 | 133 |
| 30/07/2019 | 127 |
| 30/07/2019 | 122 |
| 30/07/2019 | 124 |
| 30/07/2019 | 117 |
| 30/07/2019 | 113 |
| 30/07/2019 | 122 |
| 30/07/2019 | 126 |
| 30/07/2019 | 123 |
| 30/07/2019 | 125 |
| 31/07/2019 | 113 |
| 31/07/2019 | 108 |
| 31/07/2019 | 97 |
| 31/07/2019 | 100 |
| 31/07/2019 | 96 |
| 31/07/2019 | 94 |
| 31/07/2019 | 111 |
| 31/07/2019 | 128 |
| 31/07/2019 | 175 |
| 31/07/2019 | 201 |
| 31/07/2019 | 237 |
| 31/07/2019 | 238 |
| 31/07/2019 | 226 |
| 31/07/2019 | 227 |
| 31/07/2019 | 267 |
| 31/07/2019 | 12 |
| 31/07/2019 | 13 |
| 31/07/2019 | 27 |
| 31/07/2019 | 31 |
| 31/07/2019 | 39 |
| 31/07/2019 | 28 |
| 31/07/2019 | 50 |
| 31/07/2019 | 73 |
| 31/07/2019 | 72 |
| 01/08/2019 | 69 |
| 01/08/2019 | 42 |
| 01/08/2019 | 64 |
| 01/08/2019 | 90 |
| 01/08/2019 | 86 |
| 01/08/2019 | 80 |
| 01/08/2019 | 75 |
| 01/08/2019 | 75 |
| 01/08/2019 | 73 |
| 01/08/2019 | 78 |
| 01/08/2019 | 78 |
| 01/08/2019 | 84 |
| 01/08/2019 | 88 |
| 01/08/2019 | 101 |
| 01/08/2019 | 119 |
| 01/08/2019 | 122 |
| 01/08/2019 | 125 |
| 01/08/2019 | 119 |
| 01/08/2019 | 118 |
| 01/08/2019 | 125 |
| 01/08/2019 | 102 |
| 01/08/2019 | 92 |
| 01/08/2019 | 67 |
| 01/08/2019 | 84 |
| 02/08/2019 | 87 |
| 02/08/2019 | 80 |
| 02/08/2019 | 85 |
| 02/08/2019 | 98 |
| 02/08/2019 | 106 |
| 02/08/2019 | 98 |
| 02/08/2019 | 97 |
| 02/08/2019 | 105 |
| 02/08/2019 | 114 |
| 02/08/2019 | 119 |
| 02/08/2019 | 126 |
| 02/08/2019 | 134 |
| 02/08/2019 | 136 |
| 02/08/2019 | 131 |
| 02/08/2019 | 131 |
| 02/08/2019 | 132 |
| 02/08/2019 | 131 |
| 02/08/2019 | 147 |
| 02/08/2019 | 140 |
| 02/08/2019 | 124 |
| 02/08/2019 | 117 |
| 02/08/2019 | 109 |
| 02/08/2019 | 114 |
| 02/08/2019 | 114 |
| 03/08/2019 | 105 |
| 03/08/2019 | 109 |
| 03/08/2019 | 112 |
| 03/08/2019 | 114 |
| 03/08/2019 | 112 |
| 03/08/2019 | 99 |
| 03/08/2019 | 109 |
| 03/08/2019 | 125 |
| 03/08/2019 | 150 |
| 03/08/2019 | 144 |
| 03/08/2019 | 147 |
| 03/08/2019 | 177 |
| 03/08/2019 | 210 |
| 03/08/2019 | 234 |
| 03/08/2019 | 134 |
| 03/08/2019 | 151 |
| 03/08/2019 | 196 |
| 03/08/2019 | 206 |
| 03/08/2019 | 120 |
| 03/08/2019 | 128 |
| 03/08/2019 | 146 |
| 03/08/2019 | 188 |
| 03/08/2019 | 243 |
| 03/08/2019 | 276 |
| 04/08/2019 | 329 |
| 04/08/2019 | 323 |
| 04/08/2019 | 315 |
| 04/08/2019 | 321 |
| 04/08/2019 | 339 |
| 04/08/2019 | 264 |
| 04/08/2019 | 260 |
| 04/08/2019 | 292 |
| 04/08/2019 | 298 |
| 04/08/2019 | 283 |
| 04/08/2019 | 320 |
| 04/08/2019 | 328 |
| 04/08/2019 | 333 |
| 04/08/2019 | 320 |
| 04/08/2019 | 296 |
| 04/08/2019 | 320 |
| 04/08/2019 | 350 |
| 04/08/2019 | 354 |
| 04/08/2019 | 4 |
| 04/08/2019 | 2 |
| 04/08/2019 | 346 |
| 04/08/2019 | 3 |
| 04/08/2019 | 18 |
| 04/08/2019 | 3 |
| 05/08/2019 | 28 |
| 05/08/2019 | 40 |
| 05/08/2019 | 237 |
| 05/08/2019 | 259 |
| 05/08/2019 | 255 |
| 05/08/2019 | 261 |
| 05/08/2019 | 250 |
| 05/08/2019 | 270 |
| 05/08/2019 | 273 |
| 05/08/2019 | 269 |
| 05/08/2019 | 261 |
| 05/08/2019 | 284 |
| 05/08/2019 | 291 |
| 05/08/2019 | 307 |
| 05/08/2019 | 295 |
| 05/08/2019 | 298 |
| 05/08/2019 | 296 |
| 05/08/2019 | 301 |
| 05/08/2019 | 304 |
| 05/08/2019 | 337 |
| 05/08/2019 | 305 |
| 05/08/2019 | 114 |
| 05/08/2019 | 106 |
| 05/08/2019 | 129 |
| 06/08/2019 | 181 |
| 06/08/2019 | 229 |
| 06/08/2019 | 238 |
| 06/08/2019 | 207 |
| 06/08/2019 | 199 |
| 06/08/2019 | 208 |
| 06/08/2019 | 233 |
| 06/08/2019 | 237 |
| 06/08/2019 | 237 |
| 06/08/2019 | 263 |
| 06/08/2019 | 301 |
| 06/08/2019 | 295 |
| 06/08/2019 | 314 |
| 06/08/2019 | 313 |
| 06/08/2019 | 307 |
| 06/08/2019 | 305 |
| 06/08/2019 | 305 |
| 06/08/2019 | 311 |
| 06/08/2019 | 312 |
| 06/08/2019 | 314 |
| 06/08/2019 | 321 |
| 06/08/2019 | 316 |
| 06/08/2019 | 314 |
| 06/08/2019 | 317 |
| 07/08/2019 | 320 |
| 07/08/2019 | 323 |
| 07/08/2019 | 320 |
| 07/08/2019 | 327 |
| 07/08/2019 | 329 |
| 07/08/2019 | 330 |
| 07/08/2019 | 318 |
| 07/08/2019 | 311 |
| 07/08/2019 | 295 |
| 07/08/2019 | 307 |
| 07/08/2019 | 301 |
| 07/08/2019 | 298 |
| 07/08/2019 | 295 |
| 07/08/2019 | 292 |
| 07/08/2019 | 306 |
| 07/08/2019 | 292 |
| 07/08/2019 | 299 |
| 07/08/2019 | 304 |
| 07/08/2019 | 299 |
| 07/08/2019 | 301 |
| 07/08/2019 | 318 |
| 07/08/2019 | 325 |
| 07/08/2019 | 335 |
| 07/08/2019 | 353 |
| 08/08/2019 | 12 |
| 08/08/2019 | 222 |
| 08/08/2019 | 255 |
| 08/08/2019 | 262 |
| 08/08/2019 | 274 |
| 08/08/2019 | 255 |
| 08/08/2019 | 324 |
| 08/08/2019 | 258 |
| 08/08/2019 | 251 |
| 08/08/2019 | 256 |
| 08/08/2019 | 333 |
| 08/08/2019 | 168 |
| 08/08/2019 | 205 |
| 08/08/2019 | 295 |
| 08/08/2019 | 250 |
| 08/08/2019 | 294 |
| 08/08/2019 | 264 |
| 08/08/2019 | 318 |
| 08/08/2019 | 244 |
| 08/08/2019 | 101 |
| 08/08/2019 | 72 |
| 08/08/2019 | 89 |
| 08/08/2019 | 97 |
| 08/08/2019 | 81 |
| 09/08/2019 | 77 |
| 09/08/2019 | 88 |
| 09/08/2019 | 81 |
| 09/08/2019 | 83 |
| 09/08/2019 | 75 |
| 09/08/2019 | 55 |
| 09/08/2019 | 68 |
| 09/08/2019 | 77 |
| 09/08/2019 | 92 |
| 09/08/2019 | 104 |
| 09/08/2019 | 107 |
| 09/08/2019 | 109 |
| 09/08/2019 | 96 |
| 09/08/2019 | 100 |
| 09/08/2019 | 102 |
| 09/08/2019 | 110 |
| 09/08/2019 | 122 |
| 09/08/2019 | 125 |
| 09/08/2019 | 132 |
| 09/08/2019 | 111 |
| 09/08/2019 | 103 |
| 09/08/2019 | 98 |
| 09/08/2019 | 94 |
| 09/08/2019 | 46 |
| 10/08/2019 | 38 |
| 10/08/2019 | 75 |
| 10/08/2019 | 79 |
| 10/08/2019 | 317 |
| 10/08/2019 | 2 |
| 10/08/2019 | 18 |
| 10/08/2019 | 59 |
| 10/08/2019 | 82 |
| 10/08/2019 | 19 |
| 10/08/2019 | 7 |
| 10/08/2019 | 24 |
| 10/08/2019 | 27 |
| 10/08/2019 | 10 |
| 10/08/2019 | 357 |
| 10/08/2019 | 344 |
| 10/08/2019 | 341 |
| 10/08/2019 | 339 |
| 10/08/2019 | 5 |
| 10/08/2019 | 38 |
| 10/08/2019 | 41 |
| 10/08/2019 | 36 |
| 10/08/2019 | 66 |
| 10/08/2019 | 19 |
| 10/08/2019 | 38 |
| 11/08/2019 | 4 |
| 11/08/2019 | 335 |
| 11/08/2019 | 2 |
| 11/08/2019 | 36 |
| 11/08/2019 | 38 |
| 11/08/2019 | 48 |
| 11/08/2019 | 92 |
| 11/08/2019 | 70 |
| 11/08/2019 | 65 |
| 11/08/2019 | 54 |
| 11/08/2019 | 64 |
| 11/08/2019 | 92 |
| 11/08/2019 | 91 |
| 11/08/2019 | 84 |
| 11/08/2019 | 99 |
| 11/08/2019 | 90 |
| 11/08/2019 | 98 |
| 11/08/2019 | 88 |
| 11/08/2019 | 84 |
| 11/08/2019 | 84 |
| 11/08/2019 | 84 |
| 11/08/2019 | 85 |
| 11/08/2019 | 86 |
| 11/08/2019 | 81 |
| 12/08/2019 | 82 |
| 12/08/2019 | 87 |
| 12/08/2019 | 92 |
| 12/08/2019 | 85 |
| 12/08/2019 | 80 |
| 12/08/2019 | 84 |
| 12/08/2019 | 91 |
| 12/08/2019 | 99 |
| 12/08/2019 | 104 |
| 12/08/2019 | 72 |
| 12/08/2019 | 73 |
| 12/08/2019 | 77 |
| 12/08/2019 | 82 |
| 12/08/2019 | 82 |
| 12/08/2019 | 81 |
| 12/08/2019 | 81 |
| 12/08/2019 | 82 |
| 12/08/2019 | 77 |
| 12/08/2019 | 77 |
| 12/08/2019 | 61 |
| 12/08/2019 | 48 |
| 12/08/2019 | 32 |
| 12/08/2019 | 19 |
| 12/08/2019 | 20 |
| 13/08/2019 | 13 |
| 13/08/2019 | 359 |
| 13/08/2019 | 337 |
| 13/08/2019 | 324 |
| 13/08/2019 | 321 |
| 13/08/2019 | 328 |
| 13/08/2019 | 329 |
| 13/08/2019 | 334 |
| 13/08/2019 | 340 |
| 13/08/2019 | 319 |
| 13/08/2019 | 317 |
| 13/08/2019 | 324 |
| 13/08/2019 | 330 |
| 13/08/2019 | 344 |
| 13/08/2019 | 333 |
| 13/08/2019 | 323 |
| 13/08/2019 | 321 |
| 13/08/2019 | 314 |
| 13/08/2019 | 334 |
| 13/08/2019 | 315 |
| 13/08/2019 | 268 |
| 13/08/2019 | 187 |
| 13/08/2019 | 250 |
| 13/08/2019 | 216 |
| 14/08/2019 | 223 |
| 14/08/2019 | 250 |
| 14/08/2019 | 242 |
| 14/08/2019 | 244 |
| 14/08/2019 | 211 |
| 14/08/2019 | 221 |
| 14/08/2019 | 226 |
| 14/08/2019 | 224 |
| 14/08/2019 | 215 |
| 14/08/2019 | 220 |
| 14/08/2019 | 227 |
| 14/08/2019 | 227 |
| 14/08/2019 | 222 |
| 14/08/2019 | 224 |
| 14/08/2019 | 221 |
| 14/08/2019 | 235 |
| 14/08/2019 | 181 |
| 14/08/2019 | 121 |
| 14/08/2019 | 116 |
| 14/08/2019 | 118 |
| 14/08/2019 | 114 |
| 14/08/2019 | 129 |
| 14/08/2019 | 241 |
| 14/08/2019 | 263 |
| 15/08/2019 | 257 |
| 15/08/2019 | 257 |
| 15/08/2019 | 236 |
| 15/08/2019 | 235 |
| 15/08/2019 | 261 |
| 15/08/2019 | 259 |
| 15/08/2019 | 256 |
| 15/08/2019 | 249 |
| 15/08/2019 | 250 |
| 15/08/2019 | 260 |
| 15/08/2019 | 253 |
| 15/08/2019 | 257 |
| 15/08/2019 | 254 |
| 15/08/2019 | 272 |
| 15/08/2019 | 260 |
| 15/08/2019 | 262 |
| 15/08/2019 | 278 |
| 15/08/2019 | 283 |
| 15/08/2019 | 269 |
| 15/08/2019 | 335 |
| 15/08/2019 | 103 |
| 15/08/2019 | 134 |
| 15/08/2019 | 208 |
| 15/08/2019 | 237 |
| 16/08/2019 | 247 |
| 16/08/2019 | 253 |
| 16/08/2019 | 247 |
| 16/08/2019 | 245 |
| 16/08/2019 | 256 |
| 16/08/2019 | 171 |
| 16/08/2019 | 220 |
| 16/08/2019 | 207 |
| 16/08/2019 | 216 |
| 16/08/2019 | 184 |
| 16/08/2019 | 194 |
| 16/08/2019 | 187 |
| 16/08/2019 | 190 |
| 16/08/2019 | 208 |
| 16/08/2019 | 235 |
| 16/08/2019 | 242 |
| 16/08/2019 | 245 |
| 16/08/2019 | 255 |
| 16/08/2019 | 298 |
| 16/08/2019 | 302 |
| 16/08/2019 | 311 |
| 16/08/2019 | 299 |
| 16/08/2019 | 279 |
| 16/08/2019 | 268 |
| 17/08/2019 | 280 |
| 17/08/2019 | 287 |
| 17/08/2019 | 277 |
| 17/08/2019 | 279 |
| 17/08/2019 | 289 |
| 17/08/2019 | 283 |
| 17/08/2019 | 280 |
| 17/08/2019 | 286 |
| 17/08/2019 | 288 |
| 17/08/2019 | 283 |
| 17/08/2019 | 270 |
| 17/08/2019 | 263 |
| 17/08/2019 | 262 |
| 17/08/2019 | 261 |
| 17/08/2019 | 267 |
| 17/08/2019 | 255 |
| 17/08/2019 | 256 |
| 17/08/2019 | 259 |
| 17/08/2019 | 260 |
| 17/08/2019 | 268 |
| 17/08/2019 | 270 |
| 17/08/2019 | 267 |
| 17/08/2019 | 267 |
| 17/08/2019 | 257 |
| 18/08/2019 | 262 |
| 18/08/2019 | 261 |
| 18/08/2019 | 242 |
| 18/08/2019 | 245 |
| 18/08/2019 | 278 |
| 18/08/2019 | 227 |
| 18/08/2019 | 233 |
| 18/08/2019 | 243 |
| 18/08/2019 | 244 |
| 18/08/2019 | 236 |
| 18/08/2019 | 235 |
| 18/08/2019 | 229 |
| 18/08/2019 | 226 |
| 18/08/2019 | 226 |
| 18/08/2019 | 233 |
| 18/08/2019 | 238 |
| 18/08/2019 | 234 |
| 18/08/2019 | 216 |
| 18/08/2019 | 212 |
| 18/08/2019 | 217 |
| 18/08/2019 | 206 |
| 18/08/2019 | 234 |
| 18/08/2019 | 262 |
| 18/08/2019 | 259 |
| 19/08/2019 | 349 |
| 19/08/2019 | 338 |
| 19/08/2019 | 275 |
| 19/08/2019 | 252 |
| 19/08/2019 | 247 |
| 19/08/2019 | 115 |
| 19/08/2019 | 120 |
| 19/08/2019 | 124 |
| 19/08/2019 | 113 |
| 19/08/2019 | 89 |
| 19/08/2019 | 109 |
| 19/08/2019 | 108 |
| 19/08/2019 | 108 |
| 19/08/2019 | 124 |
| 19/08/2019 | 155 |
| 19/08/2019 | 182 |
| 19/08/2019 | 232 |
| 19/08/2019 | 260 |
| 19/08/2019 | 283 |
| 19/08/2019 | 285 |
| 19/08/2019 | 298 |
| 19/08/2019 | 356 |
| 19/08/2019 | 352 |
| 19/08/2019 | 357 |
| 20/08/2019 | 314 |
| 20/08/2019 | 326 |
| 20/08/2019 | 330 |
| 20/08/2019 | 311 |
| 20/08/2019 | 321 |
| 20/08/2019 | 268 |
| 20/08/2019 | 319 |
| 20/08/2019 | 322 |
| 20/08/2019 | 326 |
| 20/08/2019 | 340 |
| 20/08/2019 | 335 |
| 20/08/2019 | 352 |
| 20/08/2019 | 347 |
| 20/08/2019 | 329 |
| 20/08/2019 | 316 |
| 20/08/2019 | 308 |
| 20/08/2019 | 310 |
| 20/08/2019 | 294 |
| 20/08/2019 | 293 |
| 20/08/2019 | 290 |
| 20/08/2019 | 303 |
| 20/08/2019 | 325 |
| 20/08/2019 | 337 |
| 20/08/2019 | 312 |
| 21/08/2019 | 240 |
| 21/08/2019 | 256 |
| 21/08/2019 | 260 |
| 21/08/2019 | 271 |
| 21/08/2019 | 336 |
| 21/08/2019 | 7 |
| 21/08/2019 | 149 |
| 21/08/2019 | 106 |
| 21/08/2019 | 96 |
| 21/08/2019 | 112 |
| 21/08/2019 | 120 |
| 21/08/2019 | 146 |
| 21/08/2019 | 122 |
| 21/08/2019 | 114 |
| 21/08/2019 | 92 |
| 21/08/2019 | 77 |
| 21/08/2019 | 53 |
| 21/08/2019 | 75 |
| 21/08/2019 | 78 |
| 21/08/2019 | 75 |
| 21/08/2019 | 76 |
| 21/08/2019 | 77 |
| 21/08/2019 | 82 |
| 21/08/2019 | 86 |
| 22/08/2019 | 81 |
| 22/08/2019 | 73 |
| 22/08/2019 | 81 |
| 22/08/2019 | 85 |
| 22/08/2019 | 85 |
| 22/08/2019 | 83 |
| 22/08/2019 | 85 |
| 22/08/2019 | 87 |
| 22/08/2019 | 87 |
| 22/08/2019 | 88 |
| 22/08/2019 | 96 |
| 22/08/2019 | 102 |
| 22/08/2019 | 106 |
| 22/08/2019 | 110 |
| 22/08/2019 | 115 |
| 22/08/2019 | 117 |
| 22/08/2019 | 114 |
| 22/08/2019 | 115 |
| 22/08/2019 | 115 |
| 22/08/2019 | 107 |
| 22/08/2019 | 98 |
| 22/08/2019 | 102 |
| 22/08/2019 | 108 |
| 22/08/2019 | 90 |
| 23/08/2019 | 100 |
| 23/08/2019 | 98 |
| 23/08/2019 | 73 |
| 23/08/2019 | 69 |
| 23/08/2019 | 78 |
| 23/08/2019 | 81 |
| 23/08/2019 | 86 |
| 23/08/2019 | 101 |
| 23/08/2019 | 101 |
| 23/08/2019 | 115 |
| 23/08/2019 | 121 |
| 23/08/2019 | 125 |
| 23/08/2019 | 116 |
| 23/08/2019 | 109 |
| 23/08/2019 | 97 |
| 23/08/2019 | 55 |
| 23/08/2019 | 119 |
| 23/08/2019 | 128 |
| 23/08/2019 | 125 |
| 23/08/2019 | 128 |
| 23/08/2019 | 137 |
| 23/08/2019 | 142 |
| 23/08/2019 | 145 |
| 23/08/2019 | 132 |
| 24/08/2019 | 163 |
| 24/08/2019 | 155 |
| 24/08/2019 | 101 |
| 24/08/2019 | 116 |
| 24/08/2019 | 114 |
| 24/08/2019 | 123 |
| 24/08/2019 | 118 |
| 24/08/2019 | 193 |
| 24/08/2019 | 199 |
| 24/08/2019 | 168 |
| 24/08/2019 | 181 |
| 24/08/2019 | 144 |
| 24/08/2019 | 163 |
| 24/08/2019 | 182 |
| 24/08/2019 | 174 |
| 24/08/2019 | 185 |
| 24/08/2019 | 179 |
| 24/08/2019 | 165 |
| 24/08/2019 | 166 |
| 24/08/2019 | 179 |
| 24/08/2019 | 90 |
| 24/08/2019 | 339 |
| 24/08/2019 | 20 |
| 24/08/2019 | 75 |
| 25/08/2019 | 71 |
| 25/08/2019 | 83 |
| 25/08/2019 | 86 |
| 25/08/2019 | 96 |
| 25/08/2019 | 104 |
| 25/08/2019 | 112 |
| 25/08/2019 | 138 |
| 25/08/2019 | 222 |
| 25/08/2019 | 131 |
| 25/08/2019 | 329 |
| 25/08/2019 | 163 |
| 25/08/2019 | 221 |
| 25/08/2019 | 263 |
| 25/08/2019 | 261 |
| 25/08/2019 | 267 |
| 25/08/2019 | 268 |
| 25/08/2019 | 273 |
| 25/08/2019 | 273 |
| 25/08/2019 | 289 |
| 25/08/2019 | 291 |
| 25/08/2019 | 294 |
| 25/08/2019 | 292 |
| 25/08/2019 | 252 |
| 25/08/2019 | 255 |
| 26/08/2019 | 263 |
| 26/08/2019 | 276 |
| 26/08/2019 | 290 |
| 26/08/2019 | 277 |
| 26/08/2019 | 277 |
| 26/08/2019 | 272 |
| 26/08/2019 | 273 |
| 26/08/2019 | 281 |
| 26/08/2019 | 286 |
| 26/08/2019 | 279 |
| 26/08/2019 | 285 |
| 26/08/2019 | 294 |
| 26/08/2019 | 286 |
| 26/08/2019 | 280 |
| 26/08/2019 | 290 |
| 26/08/2019 | 278 |
| 26/08/2019 | 288 |
| 26/08/2019 | 293 |
| 26/08/2019 | 294 |
| 26/08/2019 | 286 |
| 26/08/2019 | 297 |
| 26/08/2019 | 268 |
| 26/08/2019 | 266 |
| 26/08/2019 | 272 |
| 27/08/2019 | 262 |
| 27/08/2019 | 271 |
| 27/08/2019 | 268 |
| 27/08/2019 | 274 |
| 27/08/2019 | 274 |
| 27/08/2019 | 279 |
| 27/08/2019 | 287 |
| 27/08/2019 | 287 |
| 27/08/2019 | 288 |
| 27/08/2019 | 290 |
| 27/08/2019 | 290 |
| 27/08/2019 | 289 |
| 27/08/2019 | 283 |
| 27/08/2019 | 280 |
| 27/08/2019 | 292 |
| 27/08/2019 | 297 |
| 27/08/2019 | 302 |
| 27/08/2019 | 293 |
| 27/08/2019 | 292 |
| 27/08/2019 | 297 |
| 27/08/2019 | 295 |
| 27/08/2019 | 283 |
| 27/08/2019 | 266 |
| 27/08/2019 | 261 |
| 28/08/2019 | 269 |
| 28/08/2019 | 270 |
| 28/08/2019 | 250 |
| 28/08/2019 | 257 |
| 28/08/2019 | 249 |
| 28/08/2019 | 248 |
| 28/08/2019 | 243 |
| 28/08/2019 | 237 |
| 28/08/2019 | 237 |
| 28/08/2019 | 226 |
| 28/08/2019 | 223 |
| 28/08/2019 | 229 |
| 28/08/2019 | 232 |
| 28/08/2019 | 236 |
| 28/08/2019 | 225 |
| 28/08/2019 | 227 |
| 28/08/2019 | 236 |
| 28/08/2019 | 328 |
| 28/08/2019 | 345 |
| 28/08/2019 | 336 |
| 28/08/2019 | 253 |
| 28/08/2019 | 261 |
| 28/08/2019 | 274 |
| 28/08/2019 | 297 |
| 29/08/2019 | 283 |
| 29/08/2019 | 281 |
| 29/08/2019 | 290 |
| 29/08/2019 | 278 |
| 29/08/2019 | 276 |
| 29/08/2019 | 276 |
| 29/08/2019 | 280 |
| 29/08/2019 | 286 |
| 29/08/2019 | 285 |
| 29/08/2019 | 287 |
| 29/08/2019 | 295 |
| 29/08/2019 | 297 |
| 29/08/2019 | 302 |
| 29/08/2019 | 290 |
| 29/08/2019 | 285 |
| 29/08/2019 | 277 |
| 29/08/2019 | 290 |
| 29/08/2019 | 295 |
| 29/08/2019 | 296 |
| 29/08/2019 | 314 |
| 29/08/2019 | 320 |
| 29/08/2019 | 327 |
| 29/08/2019 | 289 |
| 29/08/2019 | 263 |
| 30/08/2019 | 211 |
| 30/08/2019 | 250 |
| 30/08/2019 | 260 |
| 30/08/2019 | 262 |
| 30/08/2019 | 321 |
| 30/08/2019 | 288 |
| 30/08/2019 | 123 |
| 30/08/2019 | 85 |
| 30/08/2019 | 89 |
| 30/08/2019 | 98 |
| 30/08/2019 | 97 |
| 30/08/2019 | 107 |
| 30/08/2019 | 125 |
| 30/08/2019 | 159 |
| 30/08/2019 | 101 |
| 30/08/2019 | 87 |
| 30/08/2019 | 70 |
| 30/08/2019 | 55 |
| 30/08/2019 | 74 |
| 30/08/2019 | 76 |
| 30/08/2019 | 79 |
| 30/08/2019 | 90 |
| 30/08/2019 | 104 |
| 30/08/2019 | 96 |
| 31/08/2019 | 85 |
| 31/08/2019 | 54 |
| 31/08/2019 | 51 |
| 31/08/2019 | 78 |
| 31/08/2019 | 57 |
| 31/08/2019 | 60 |
| 31/08/2019 | 46 |
| 31/08/2019 | 85 |
| 31/08/2019 | 95 |
| 31/08/2019 | 120 |
| 31/08/2019 | 155 |
| 31/08/2019 | 144 |
| 31/08/2019 | 149 |
| 31/08/2019 | 171 |
| 31/08/2019 | 181 |
| 31/08/2019 | 187 |
| 31/08/2019 | 200 |
| 31/08/2019 | 203 |
| 31/08/2019 | 179 |
| 31/08/2019 | 182 |
| 31/08/2019 | 164 |
| 31/08/2019 | 156 |
| 31/08/2019 | 200 |
| 31/08/2019 | 237 |